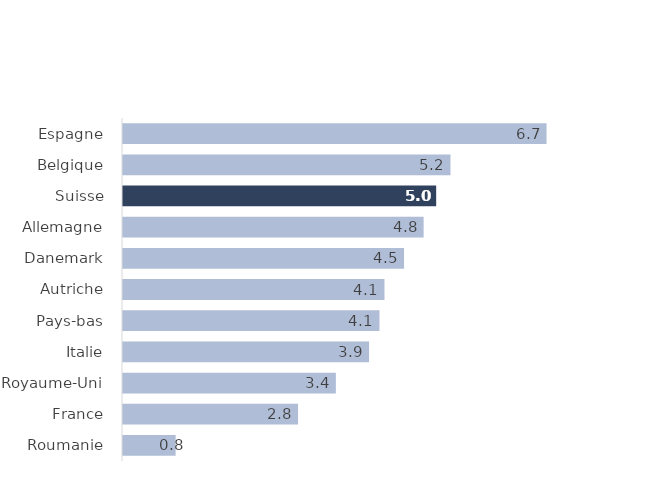
| Category | Series 2 |
|---|---|
| Roumanie | 0.834 |
| France | 2.773 |
| Royaume-Uni | 3.372 |
| Italie | 3.898 |
| Pays-bas | 4.063 |
| Autriche | 4.142 |
| Danemark | 4.452 |
| Allemagne | 4.762 |
| Suisse | 4.961 |
| Belgique | 5.188 |
| Espagne | 6.71 |